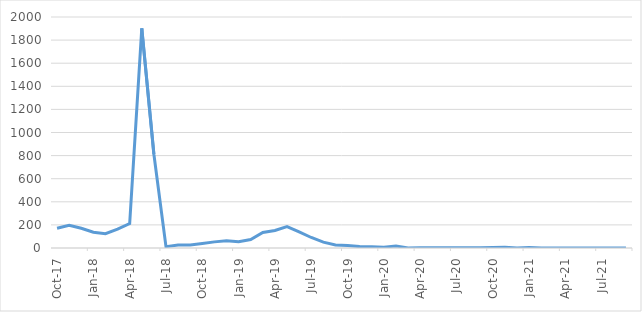
| Category | Frequency |
|---|---|
| 2017-10-01 | 171 |
| 2017-11-01 | 196 |
| 2017-12-01 | 171 |
| 2018-01-01 | 136 |
| 2018-02-01 | 124 |
| 2018-03-01 | 163 |
| 2018-04-01 | 211 |
| 2018-05-01 | 1902 |
| 2018-06-01 | 812 |
| 2018-07-01 | 12 |
| 2018-08-01 | 26 |
| 2018-09-01 | 27 |
| 2018-10-01 | 39 |
| 2018-11-01 | 53 |
| 2018-12-01 | 62 |
| 2019-01-01 | 55 |
| 2019-02-01 | 74 |
| 2019-03-01 | 135 |
| 2019-04-01 | 152 |
| 2019-05-01 | 185 |
| 2019-06-01 | 140 |
| 2019-07-01 | 91 |
| 2019-08-01 | 51 |
| 2019-09-01 | 26 |
| 2019-10-01 | 21 |
| 2019-11-01 | 12 |
| 2019-12-01 | 10 |
| 2020-01-01 | 7 |
| 2020-02-01 | 18 |
| 2020-03-01 | 1 |
| 2020-04-01 | 2 |
| 2020-05-01 | 2 |
| 2020-09-01 | 2 |
| 2020-11-01 | 6 |
| 2020-12-01 | 1 |
| 2021-01-01 | 5 |
| 2021-02-01 | 0 |
| 2021-03-01 | 0 |
| 2021-04-01 | 0 |
| 2021-05-01 | 0 |
| 2021-06-01 | 0 |
| 2021-07-01 | 0 |
| 2021-08-01 | 0 |
| 2021-09-01 | 0 |